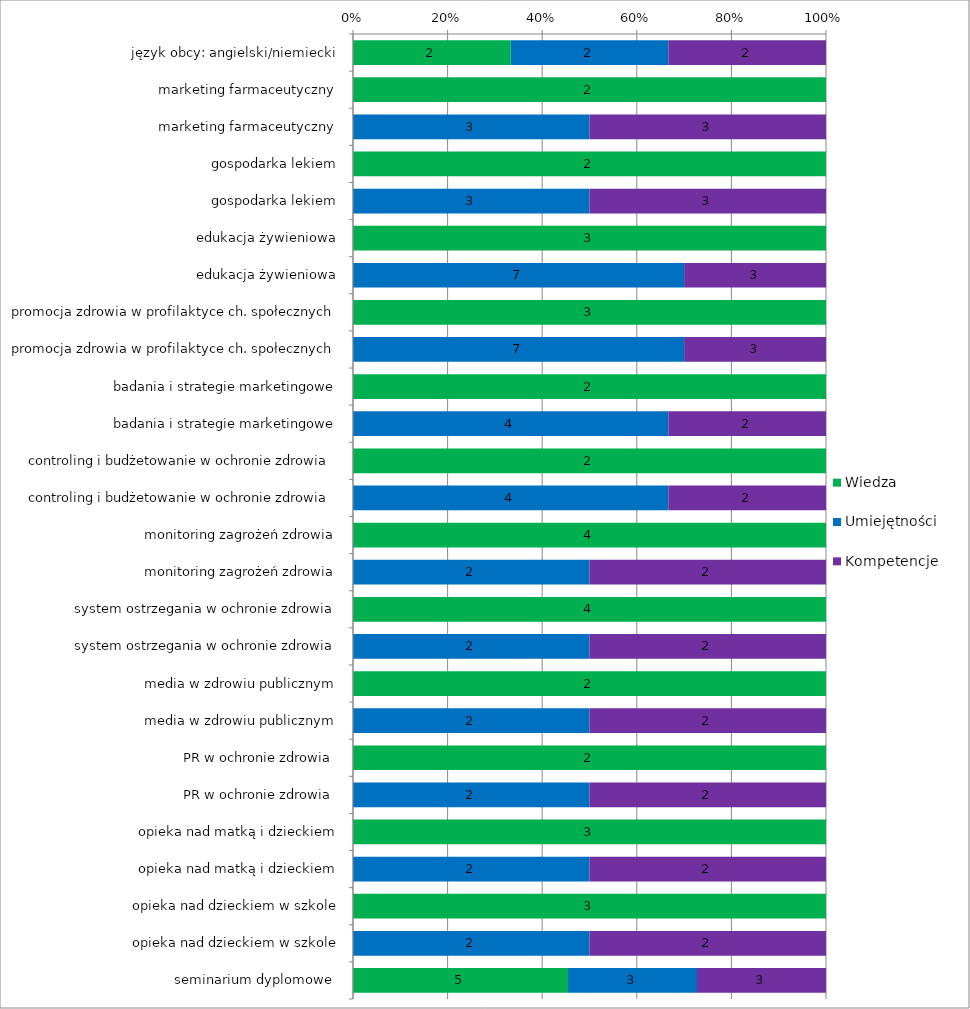
| Category | Wiedza | Umiejętności | Kompetencje |
|---|---|---|---|
| język obcy: angielski/niemiecki | 2 | 2 | 2 |
| marketing farmaceutyczny | 2 | 0 | 0 |
| marketing farmaceutyczny | 0 | 3 | 3 |
| gospodarka lekiem | 2 | 0 | 0 |
| gospodarka lekiem | 0 | 3 | 3 |
| edukacja żywieniowa | 3 | 0 | 0 |
| edukacja żywieniowa | 0 | 7 | 3 |
| promocja zdrowia w profilaktyce ch. społecznych | 3 | 0 | 0 |
| promocja zdrowia w profilaktyce ch. społecznych | 0 | 7 | 3 |
| badania i strategie marketingowe | 2 | 0 | 0 |
| badania i strategie marketingowe | 0 | 4 | 2 |
| controling i budżetowanie w ochronie zdrowia  | 2 | 0 | 0 |
| controling i budżetowanie w ochronie zdrowia  | 0 | 4 | 2 |
| monitoring zagrożeń zdrowia | 4 | 0 | 0 |
| monitoring zagrożeń zdrowia | 0 | 2 | 2 |
| system ostrzegania w ochronie zdrowia | 4 | 0 | 0 |
| system ostrzegania w ochronie zdrowia | 0 | 2 | 2 |
| media w zdrowiu publicznym | 2 | 0 | 0 |
| media w zdrowiu publicznym | 0 | 2 | 2 |
| PR w ochronie zdrowia  | 2 | 0 | 0 |
| PR w ochronie zdrowia  | 0 | 2 | 2 |
| opieka nad matką i dzieckiem | 3 | 0 | 0 |
| opieka nad matką i dzieckiem | 0 | 2 | 2 |
| opieka nad dzieckiem w szkole | 3 | 0 | 0 |
| opieka nad dzieckiem w szkole | 0 | 2 | 2 |
| seminarium dyplomowe  | 5 | 3 | 3 |